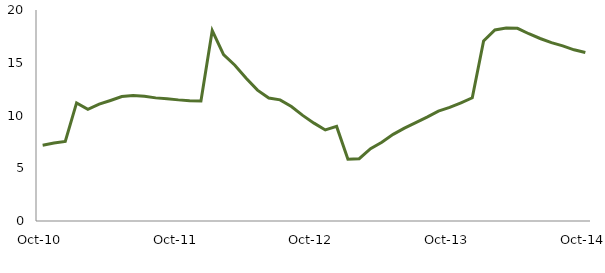
| Category | Series 0 |
|---|---|
| Oct-10 | 7.189 |
|  | 7.391 |
|  | 7.544 |
|  | 11.192 |
|  | 10.576 |
|  | 11.074 |
|  | 11.424 |
|  | 11.795 |
|  | 11.884 |
|  | 11.821 |
|  | 11.67 |
|  | 11.588 |
| Oct-11 | 11.481 |
|  | 11.403 |
|  | 11.374 |
|  | 18.05 |
|  | 15.769 |
|  | 14.767 |
|  | 13.533 |
|  | 12.403 |
|  | 11.663 |
|  | 11.484 |
|  | 10.846 |
|  | 10.011 |
| Oct-12 | 9.276 |
|  | 8.633 |
|  | 8.963 |
|  | 5.86 |
|  | 5.902 |
|  | 6.851 |
|  | 7.471 |
|  | 8.212 |
|  | 8.796 |
|  | 9.326 |
|  | 9.847 |
|  | 10.415 |
| Oct-13 | 10.762 |
|  | 11.207 |
|  | 11.678 |
|  | 17.072 |
|  | 18.112 |
|  | 18.284 |
|  | 18.263 |
|  | 17.75 |
|  | 17.299 |
|  | 16.908 |
|  | 16.599 |
|  | 16.228 |
| Oct-14 | 15.967 |